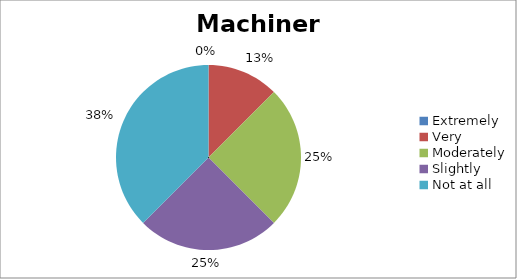
| Category | Machinery |
|---|---|
| Extremely | 0 |
| Very | 1 |
| Moderately | 2 |
| Slightly | 2 |
| Not at all | 3 |